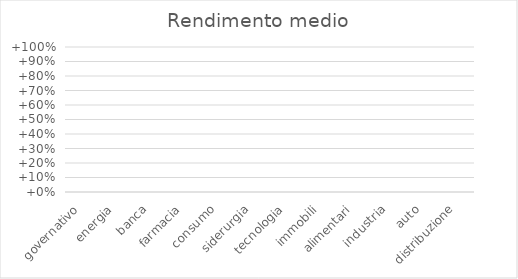
| Category | Rendimento medio |
|---|---|
| governativo | 0 |
| energia | 0 |
| banca | 0 |
| farmacia | 0 |
| consumo | 0 |
| siderurgia | 0 |
| tecnologia | 0 |
| immobili | 0 |
| alimentari | 0 |
| industria | 0 |
| auto | 0 |
| distribuzione | 0 |